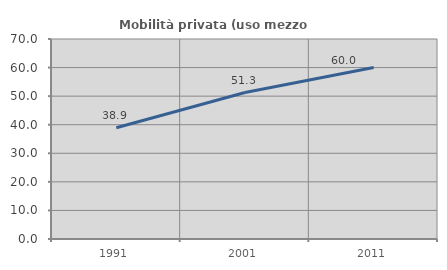
| Category | Mobilità privata (uso mezzo privato) |
|---|---|
| 1991.0 | 38.942 |
| 2001.0 | 51.267 |
| 2011.0 | 60 |